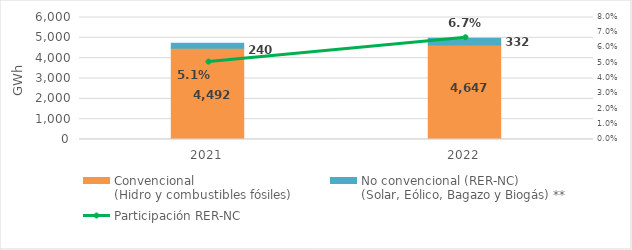
| Category | Convencional
(Hidro y combustibles fósiles) | No convencional (RER-NC)
(Solar, Eólico, Bagazo y Biogás) ** |
|---|---|---|
| 2021.0 | 4491.992 | 240.19 |
| 2022.0 | 4646.571 | 332.184 |